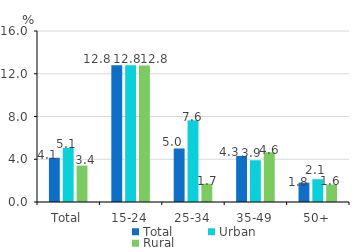
| Category | Total | Urban | Rural |
|---|---|---|---|
| Total | 4.138 | 5.054 | 3.407 |
| 15-24 | 12.789 | 12.796 | 12.779 |
| 25-34 | 5.007 | 7.639 | 1.708 |
| 35-49 | 4.31 | 3.904 | 4.65 |
| 50+ | 1.807 | 2.131 | 1.635 |